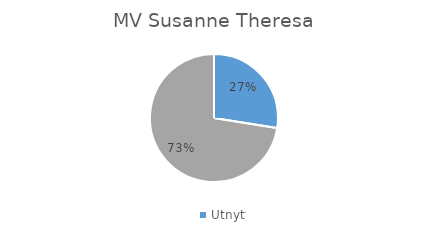
| Category | Series 0 |
|---|---|
| 0 | 0.275 |
| 1 | 0.725 |